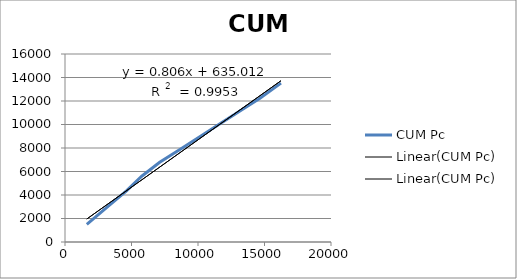
| Category | CUM Pc |
|---|---|
| 1640.0 | 1504 |
| 3190.0 | 2984 |
| 4620.0 | 4360 |
| 5770.0 | 5600 |
| 7120.0 | 6784 |
| 8700.0 | 7920 |
| 10250.0 | 9040 |
| 11680.0 | 10080 |
| 13180.0 | 11176 |
| 14630.0 | 12216 |
| 16240.0 | 13520 |